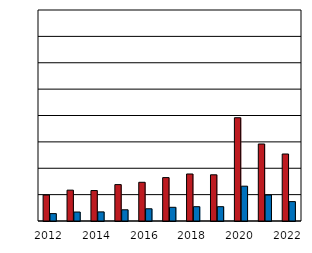
| Category | ženy  Women | muži  
Men |
|---|---|---|
| 2012.0 | 19.7 | 5.6 |
| 2013.0 | 23.4 | 6.8 |
| 2014.0 | 23.1 | 6.9 |
| 2015.0 | 27.6 | 8.5 |
| 2016.0 | 29.356 | 9.267 |
| 2017.0 | 32.91 | 10.39 |
| 2018.0 | 35.642 | 10.846 |
| 2019.0 | 35.031 | 10.855 |
| 2020.0 | 78.3 | 26.4 |
| 2021.0 | 58.4 | 19.7 |
| 2022.0 | 50.8 | 14.7 |